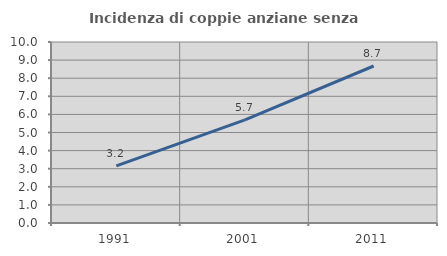
| Category | Incidenza di coppie anziane senza figli  |
|---|---|
| 1991.0 | 3.156 |
| 2001.0 | 5.695 |
| 2011.0 | 8.674 |